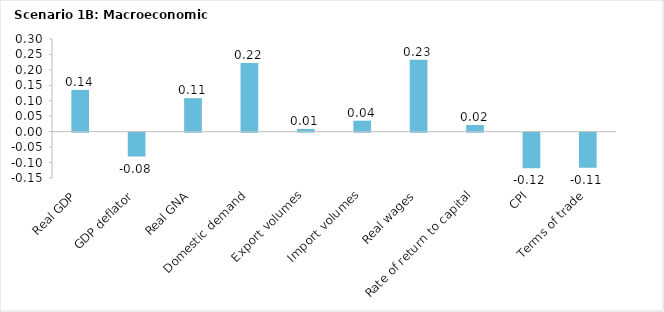
| Category | Series 0 |
|---|---|
| Real GDP | 0.135 |
| GDP deflator | -0.077 |
| Real GNA | 0.108 |
| Domestic demand | 0.222 |
| Export volumes | 0.009 |
| Import volumes | 0.036 |
| Real wages | 0.233 |
| Rate of return to capital | 0.022 |
| CPI | -0.115 |
| Terms of trade | -0.114 |